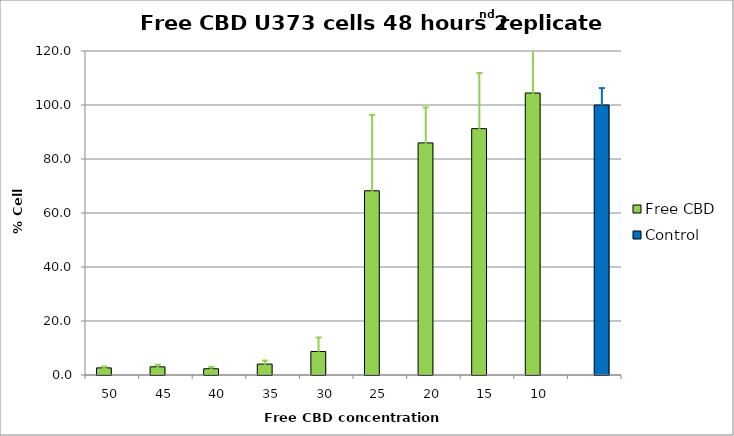
| Category | Free CBD | Control |
|---|---|---|
| 50.0 | 2.635 |  |
| 45.0 | 3.032 |  |
| 40.0 | 2.313 |  |
| 35.0 | 4.044 |  |
| 30.0 | 8.706 |  |
| 25.0 | 68.24 |  |
| 20.0 | 85.956 |  |
| 15.0 | 91.24 |  |
| 10.0 | 104.452 |  |